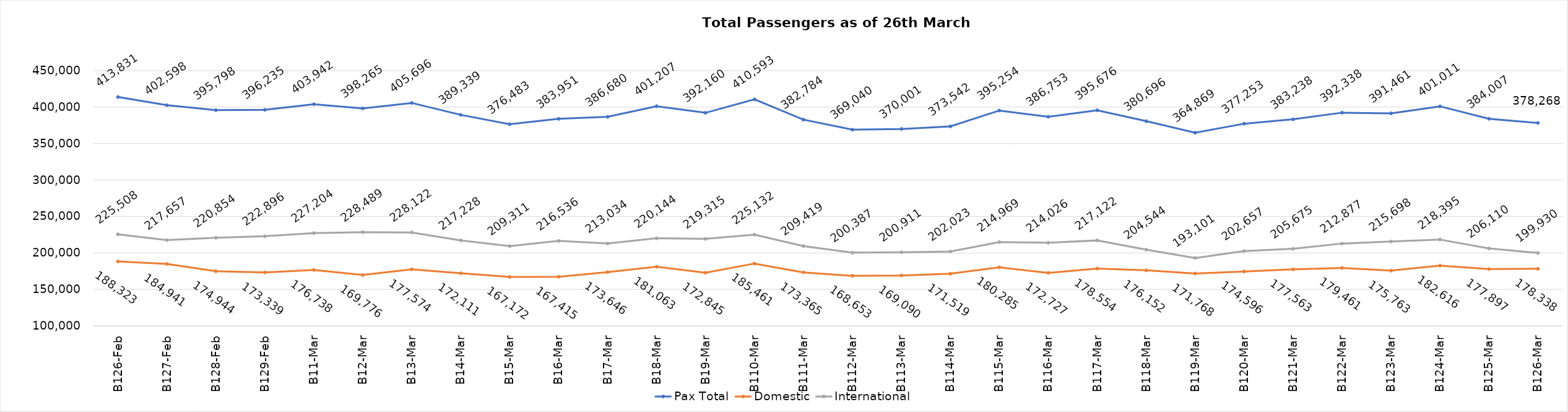
| Category | Pax Total | Domestic | International |
|---|---|---|---|
| 2024-02-26 | 413831 | 188323 | 225508 |
| 2024-02-27 | 402598 | 184941 | 217657 |
| 2024-02-28 | 395798 | 174944 | 220854 |
| 2024-02-29 | 396235 | 173339 | 222896 |
| 2024-03-01 | 403942 | 176738 | 227204 |
| 2024-03-02 | 398265 | 169776 | 228489 |
| 2024-03-03 | 405696 | 177574 | 228122 |
| 2024-03-04 | 389339 | 172111 | 217228 |
| 2024-03-05 | 376483 | 167172 | 209311 |
| 2024-03-06 | 383951 | 167415 | 216536 |
| 2024-03-07 | 386680 | 173646 | 213034 |
| 2024-03-08 | 401207 | 181063 | 220144 |
| 2024-03-09 | 392160 | 172845 | 219315 |
| 2024-03-10 | 410593 | 185461 | 225132 |
| 2024-03-11 | 382784 | 173365 | 209419 |
| 2024-03-12 | 369040 | 168653 | 200387 |
| 2024-03-13 | 370001 | 169090 | 200911 |
| 2024-03-14 | 373542 | 171519 | 202023 |
| 2024-03-15 | 395254 | 180285 | 214969 |
| 2024-03-16 | 386753 | 172727 | 214026 |
| 2024-03-17 | 395676 | 178554 | 217122 |
| 2024-03-18 | 380696 | 176152 | 204544 |
| 2024-03-19 | 364869 | 171768 | 193101 |
| 2024-03-20 | 377253 | 174596 | 202657 |
| 2024-03-21 | 383238 | 177563 | 205675 |
| 2024-03-22 | 392338 | 179461 | 212877 |
| 2024-03-23 | 391461 | 175763 | 215698 |
| 2024-03-24 | 401011 | 182616 | 218395 |
| 2024-03-25 | 384007 | 177897 | 206110 |
| 2024-03-26 | 378268 | 178338 | 199930 |